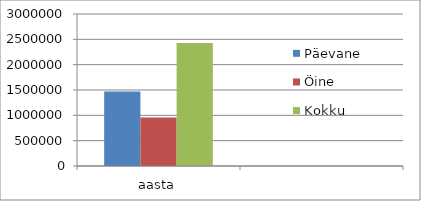
| Category | Päevane | Öine | Kokku |
|---|---|---|---|
| aasta | 1470143.6 | 956144.7 | 2426288.3 |